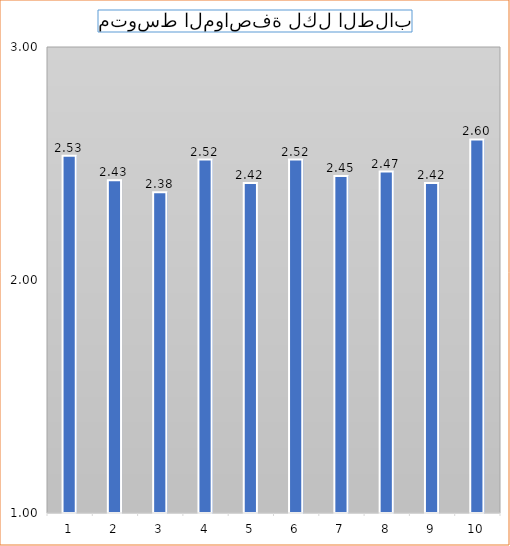
| Category | Series 0 |
|---|---|
| 0 | 2.533 |
| 1 | 2.428 |
| 2 | 2.376 |
| 3 | 2.517 |
| 4 | 2.416 |
| 5 | 2.517 |
| 6 | 2.447 |
| 7 | 2.466 |
| 8 | 2.416 |
| 9 | 2.603 |